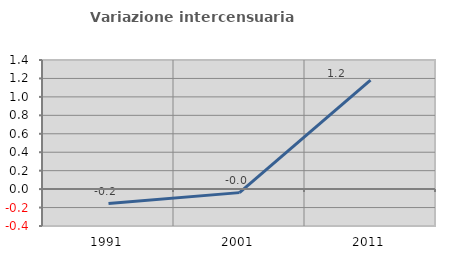
| Category | Variazione intercensuaria annua |
|---|---|
| 1991.0 | -0.157 |
| 2001.0 | -0.038 |
| 2011.0 | 1.182 |